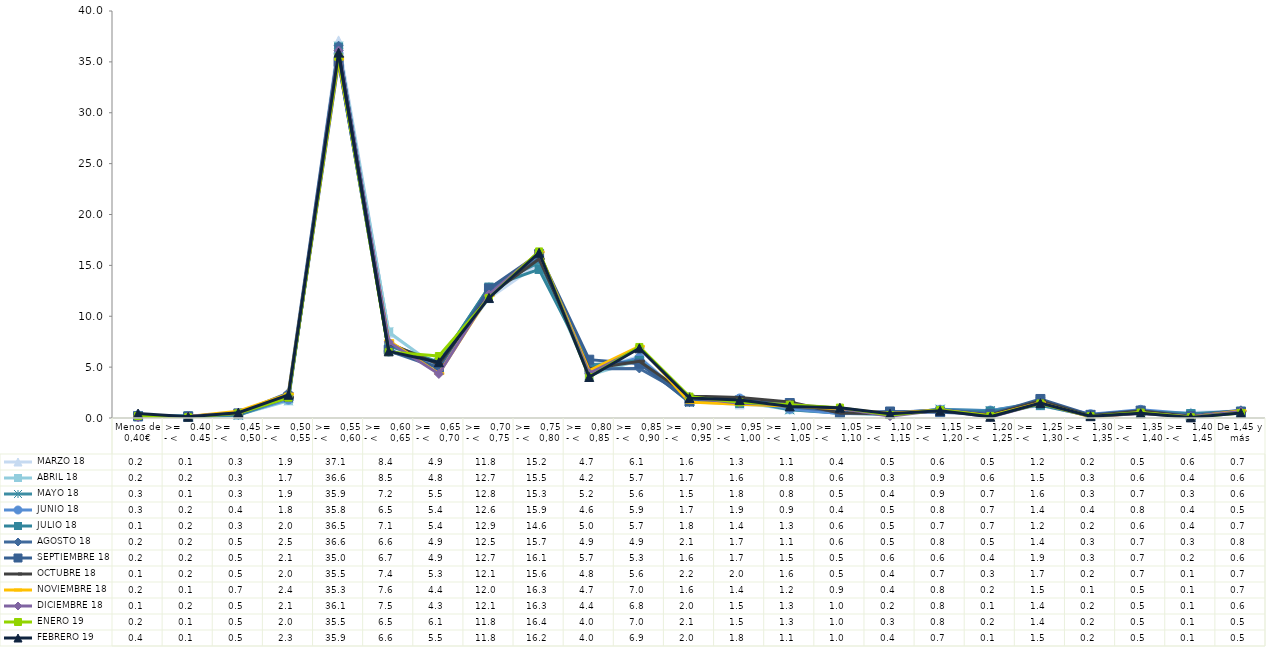
| Category |  MARZO 18 |  ABRIL 18 |  MAYO 18 |  JUNIO 18 |  JULIO 18 |  AGOSTO 18 |  SEPTIEMBRE 18 |  OCTUBRE 18 |  NOVIEMBRE 18 |  DICIEMBRE 18 |  ENERO 19 |  FEBRERO 19 |
|---|---|---|---|---|---|---|---|---|---|---|---|---|
| Menos de 0,40€ | 0.24 | 0.2 | 0.25 | 0.28 | 0.12 | 0.15 | 0.17 | 0.08 | 0.16 | 0.07 | 0.2 | 0.44 |
| >=   0.40 - <    0.45 | 0.1 | 0.16 | 0.11 | 0.17 | 0.22 | 0.15 | 0.15 | 0.15 | 0.14 | 0.18 | 0.08 | 0.12 |
| >=   0,45 - <    0,50 | 0.33 | 0.32 | 0.28 | 0.4 | 0.33 | 0.47 | 0.45 | 0.53 | 0.66 | 0.47 | 0.46 | 0.52 |
| >=   0,50 - <    0,55 | 1.9 | 1.69 | 1.94 | 1.81 | 2.02 | 2.48 | 2.09 | 2.02 | 2.35 | 2.08 | 2 | 2.28 |
| >=   0,55 - <    0,60 | 37.11 | 36.55 | 35.9 | 35.81 | 36.45 | 36.59 | 34.99 | 35.48 | 35.27 | 36.11 | 35.5 | 35.91 |
| >=   0,60 - <    0,65 | 8.37 | 8.46 | 7.24 | 6.54 | 7.09 | 6.6 | 6.71 | 7.36 | 7.6 | 7.48 | 6.48 | 6.55 |
| >=   0,65 - <   0,70 | 4.94 | 4.82 | 5.48 | 5.37 | 5.43 | 4.89 | 4.94 | 5.26 | 4.37 | 4.33 | 6.09 | 5.48 |
| >=   0,70 - <   0,75 | 11.77 | 12.66 | 12.8 | 12.63 | 12.87 | 12.53 | 12.72 | 12.06 | 12.03 | 12.14 | 11.8 | 11.8 |
| >=   0,75 - <   0,80 | 15.19 | 15.48 | 15.29 | 15.89 | 14.6 | 15.68 | 16.11 | 15.63 | 16.31 | 16.26 | 16.37 | 16.24 |
| >=   0,80 - <   0,85 | 4.73 | 4.21 | 5.24 | 4.61 | 5.02 | 4.85 | 5.73 | 4.81 | 4.65 | 4.4 | 4.02 | 4.03 |
| >=   0,85 - <   0,90 | 6.06 | 5.68 | 5.56 | 5.93 | 5.66 | 4.87 | 5.34 | 5.57 | 7.04 | 6.84 | 6.98 | 6.85 |
| >=   0,90 - <    0,95 | 1.62 | 1.67 | 1.52 | 1.71 | 1.79 | 2.1 | 1.62 | 2.15 | 1.56 | 2.04 | 2.1 | 1.96 |
| >=   0,95 - <   1,00 | 1.33 | 1.6 | 1.79 | 1.92 | 1.43 | 1.74 | 1.68 | 2.01 | 1.35 | 1.45 | 1.54 | 1.76 |
| >=   1,00 - <   1,05 | 1.09 | 0.82 | 0.81 | 0.91 | 1.3 | 1.1 | 1.47 | 1.58 | 1.18 | 1.33 | 1.31 | 1.14 |
| >=   1,05 - <    1,10 | 0.4 | 0.55 | 0.46 | 0.44 | 0.63 | 0.64 | 0.52 | 0.5 | 0.9 | 0.95 | 1.02 | 1.01 |
| >=   1,10 - <   1,15 | 0.52 | 0.34 | 0.35 | 0.54 | 0.45 | 0.48 | 0.64 | 0.42 | 0.44 | 0.18 | 0.29 | 0.42 |
| >=   1,15 - <    1,20 | 0.6 | 0.85 | 0.86 | 0.78 | 0.7 | 0.82 | 0.57 | 0.71 | 0.79 | 0.78 | 0.79 | 0.71 |
| >=   1,20 - <    1,25 | 0.45 | 0.55 | 0.71 | 0.73 | 0.69 | 0.46 | 0.38 | 0.3 | 0.23 | 0.09 | 0.2 | 0.12 |
| >=   1,25 - <    1,30 | 1.23 | 1.47 | 1.56 | 1.42 | 1.24 | 1.43 | 1.87 | 1.68 | 1.5 | 1.43 | 1.43 | 1.46 |
| >=   1,30 - <    1,35 | 0.21 | 0.26 | 0.28 | 0.37 | 0.2 | 0.28 | 0.31 | 0.21 | 0.1 | 0.15 | 0.18 | 0.18 |
| >=   1,35 - <    1,40 | 0.54 | 0.64 | 0.67 | 0.81 | 0.63 | 0.68 | 0.73 | 0.68 | 0.5 | 0.45 | 0.53 | 0.46 |
| >=   1,40 - <    1,45 | 0.55 | 0.42 | 0.31 | 0.42 | 0.43 | 0.25 | 0.18 | 0.14 | 0.11 | 0.12 | 0.08 | 0.06 |
| De 1,45 y más | 0.7 | 0.59 | 0.59 | 0.51 | 0.68 | 0.76 | 0.61 | 0.67 | 0.72 | 0.63 | 0.5 | 0.49 |